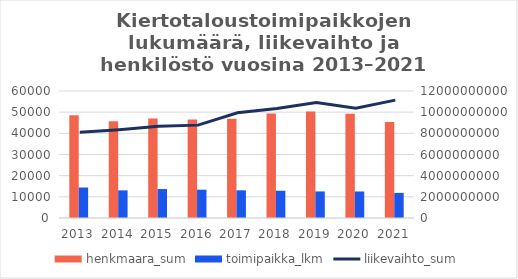
| Category | henkmaara_sum | toimipaikka_lkm |
|---|---|---|
| 2013.0 | 48484.431 | 14407 |
| 2014.0 | 45730.718 | 13058 |
| 2015.0 | 47056.663 | 13677 |
| 2016.0 | 46549.669 | 13374 |
| 2017.0 | 46880.955 | 13071 |
| 2018.0 | 49381.699 | 12878 |
| 2019.0 | 50293.421 | 12551 |
| 2020.0 | 49300.872 | 12533 |
| 2021.0 | 45302.73 | 11856 |